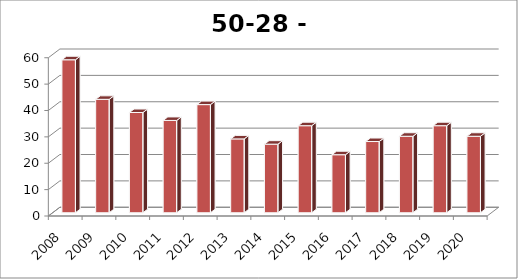
| Category | Biest-Houtakker |
|---|---|
| 2008.0 | 58 |
| 2009.0 | 43 |
| 2010.0 | 38 |
| 2011.0 | 35 |
| 2012.0 | 41 |
| 2013.0 | 28 |
| 2014.0 | 26 |
| 2015.0 | 33 |
| 2016.0 | 22 |
| 2017.0 | 27 |
| 2018.0 | 29 |
| 2019.0 | 33 |
| 2020.0 | 29 |